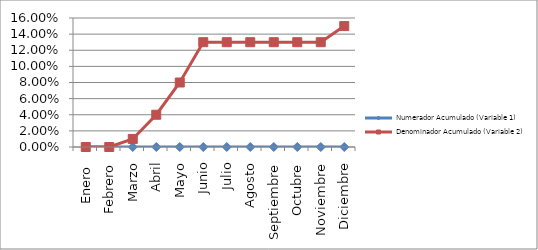
| Category | Numerador Acumulado (Variable 1) | Denominador Acumulado (Variable 2) |
|---|---|---|
| Enero  | 0 | 0 |
| Febrero | 0 | 0 |
| Marzo | 0 | 0.01 |
| Abril | 0 | 0.04 |
| Mayo | 0 | 0.08 |
| Junio | 0 | 0.13 |
| Julio | 0 | 0.13 |
| Agosto | 0 | 0.13 |
| Septiembre | 0 | 0.13 |
| Octubre | 0 | 0.13 |
| Noviembre | 0 | 0.13 |
| Diciembre | 0 | 0.15 |